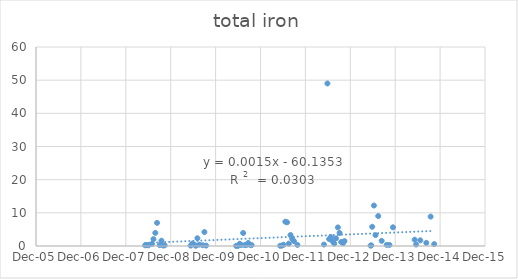
| Category | Series 0 |
|---|---|
| 39577.0 | 0.2 |
| 39590.0 | 0.3 |
| 39604.0 | 0.2 |
| 39633.0 | 0.64 |
| 39645.0 | 2.08 |
| 39660.0 | 3.95 |
| 39674.0 | 6.98 |
| 39695.0 | 0.26 |
| 39710.0 | 1.6 |
| 39723.0 | 0.15 |
| 39736.0 | 0.2 |
| 39947.0 | 0.12 |
| 39961.0 | 0.71 |
| 39974.0 | 0.48 |
| 39989.0 | 0.07 |
| 40002.0 | 2.34 |
| 40017.0 | 0.41 |
| 40045.0 | 0.234 |
| 40059.0 | 4.2 |
| 40073.0 | 0.124 |
| 40317.0 | 0.03 |
| 40332.0 | 0.048 |
| 40346.0 | 0.678 |
| 40359.0 | 0.294 |
| 40374.0 | 3.92 |
| 40388.0 | 0.265 |
| 40402.0 | 0.358 |
| 40415.0 | 0.908 |
| 40429.0 | 0.355 |
| 40443.0 | 0.273 |
| 40675.0 | 0.07 |
| 40689.0 | 0.117 |
| 40702.0 | 0.368 |
| 40717.0 | 7.32 |
| 40731.0 | 7.15 |
| 40745.0 | 0.707 |
| 40759.0 | 3.32 |
| 40773.0 | 2.16 |
| 40787.0 | 1.47 |
| 40815.0 | 0.325 |
| 41031.0 | 0.424 |
| 41059.0 | 49 |
| 41073.0 | 2.09 |
| 41087.0 | 2.71 |
| 41101.0 | 1.38 |
| 41115.0 | 0.73 |
| 41129.0 | 2.3 |
| 41144.0 | 5.6 |
| 41158.0 | 3.93 |
| 41171.0 | 1.21 |
| 41186.0 | 0.851 |
| 41198.0 | 1.48 |
| 41410.0 | 0.116 |
| 41416.0 | 0.191 |
| 41423.0 | 5.79 |
| 41437.0 | 12.2 |
| 41450.0 | 3.28 |
| 41472.0 | 9.03 |
| 41500.0 | 1.55 |
| 41541.0 | 0.345 |
| 41563.0 | 0.327 |
| 41592.0 | 5.63 |
| 41768.0 | 1.91 |
| 41780.0 | 0.438 |
| 41814.0 | 1.71 |
| 41863.0 | 0.945 |
| 41898.0 | 8.86 |
| 41927.0 | 0.575 |